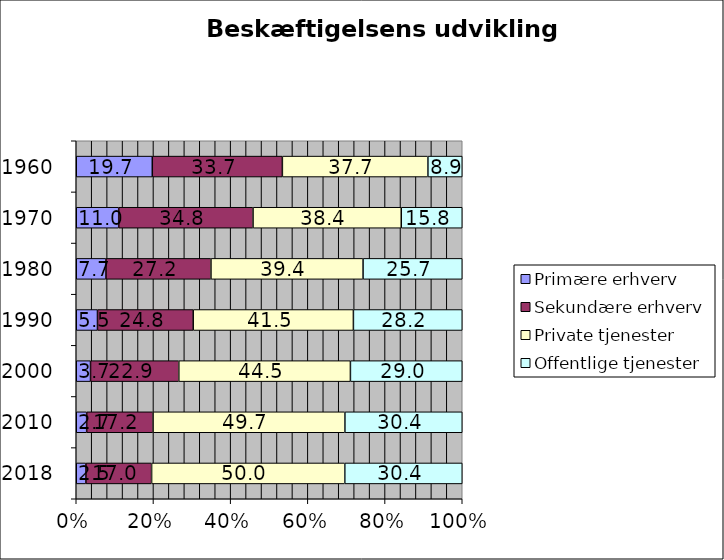
| Category | Primære erhverv | Sekundære erhverv | Private tjenester | Offentlige tjenester |
|---|---|---|---|---|
| 2018.0 | 2.5 | 17 | 50 | 30.4 |
| 2010.0 | 2.7 | 17.2 | 49.7 | 30.4 |
| 2000.0 | 3.7 | 22.9 | 44.5 | 29 |
| 1990.0 | 5.5 | 24.8 | 41.5 | 28.2 |
| 1980.0 | 7.7 | 27.2 | 39.4 | 25.7 |
| 1970.0 | 11 | 34.8 | 38.4 | 15.8 |
| 1960.0 | 19.7 | 33.7 | 37.7 | 8.9 |